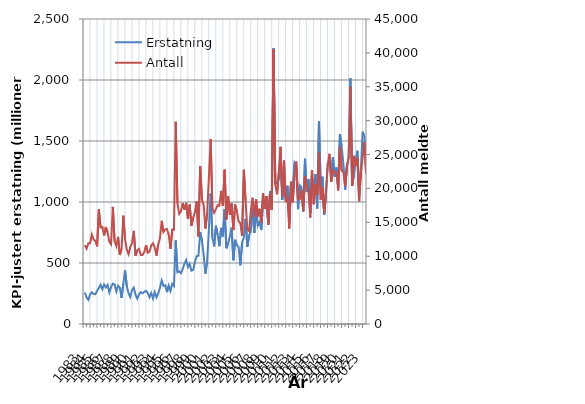
| Category | Erstatning |
|---|---|
| 1983.0 | 258.225 |
| nan | 216.303 |
| nan | 197.809 |
| nan | 242.308 |
| 1984.0 | 259.834 |
| nan | 245.784 |
| nan | 243.69 |
| nan | 272.569 |
| 1985.0 | 294.547 |
| nan | 321.948 |
| nan | 285.284 |
| nan | 323.55 |
| 1986.0 | 299.981 |
| nan | 320.992 |
| nan | 258.355 |
| nan | 302.335 |
| 1987.0 | 330.295 |
| nan | 325.94 |
| nan | 266.731 |
| nan | 313.817 |
| 1988.0 | 298.69 |
| nan | 212.92 |
| nan | 331.628 |
| nan | 439.315 |
| 1989.0 | 310.366 |
| nan | 250.85 |
| nan | 220.727 |
| nan | 278.472 |
| 1990.0 | 298.17 |
| nan | 239.878 |
| nan | 208.039 |
| nan | 242.149 |
| 1991.0 | 261.302 |
| nan | 251.241 |
| nan | 262.94 |
| nan | 271.847 |
| 1992.0 | 253.956 |
| nan | 218.822 |
| nan | 252.843 |
| nan | 208.646 |
| 1993.0 | 261.793 |
| nan | 217.87 |
| nan | 251.71 |
| nan | 297.781 |
| 1994.0 | 356.658 |
| nan | 311.8 |
| nan | 316.785 |
| nan | 261.11 |
| 1995.0 | 314.582 |
| nan | 270.634 |
| nan | 328.849 |
| nan | 312.226 |
| 1996.0 | 684.709 |
| nan | 423.984 |
| nan | 431.558 |
| nan | 416.204 |
| 1997.0 | 450.577 |
| nan | 494.432 |
| nan | 523.609 |
| nan | 467.18 |
| 1998.0 | 492.864 |
| nan | 436.631 |
| nan | 443.764 |
| nan | 510.057 |
| 1999.0 | 556.325 |
| nan | 559.028 |
| nan | 752.243 |
| nan | 681.255 |
| 2000.0 | 567.872 |
| nan | 412.399 |
| nan | 511.259 |
| nan | 779.512 |
| 2001.0 | 1069.791 |
| nan | 708.206 |
| nan | 636.063 |
| nan | 804.75 |
| 2002.0 | 732.931 |
| nan | 637.721 |
| nan | 788.114 |
| nan | 718.147 |
| 2003.0 | 939.238 |
| nan | 620.99 |
| nan | 660.655 |
| nan | 719.686 |
| 2004.0 | 789.535 |
| nan | 521.987 |
| nan | 690.088 |
| nan | 645.02 |
| 2005.0 | 631.317 |
| nan | 481.782 |
| nan | 668.844 |
| nan | 708.806 |
| 2006.0 | 861.566 |
| nan | 631.84 |
| nan | 727.01 |
| nan | 758.472 |
| 2007.0 | 949.379 |
| nan | 746.412 |
| nan | 953.667 |
| nan | 806.308 |
| 2008.0 | 833.827 |
| nan | 771.914 |
| nan | 1008.165 |
| nan | 968.238 |
| 2009.0 | 1016.058 |
| nan | 824.877 |
| nan | 1089.641 |
| nan | 1029.938 |
| 2010.0 | 2259.267 |
| nan | 1152.338 |
| nan | 1157.882 |
| nan | 1184.563 |
| 2011.0 | 1399.936 |
| nan | 1018.001 |
| nan | 1213.809 |
| nan | 1022.955 |
| 2012.0 | 1133.294 |
| nan | 828.542 |
| nan | 1142.327 |
| nan | 1075.609 |
| 2013.0 | 1320.961 |
| nan | 1293.47 |
| nan | 941.188 |
| nan | 1136.846 |
| 2014.0 | 1121.235 |
| nan | 920.756 |
| nan | 1354.48 |
| nan | 1082.988 |
| 2015.0 | 1188.179 |
| nan | 909.936 |
| nan | 1204.496 |
| nan | 1069.455 |
| 2016.0 | 1229.422 |
| nan | 946.332 |
| nan | 1659.698 |
| nan | 1126.106 |
| 2017.0 | 1207.17 |
| nan | 895.328 |
| nan | 1057.392 |
| nan | 1320.332 |
| 2018.0 | 1347.868 |
| nan | 1226.201 |
| nan | 1366.79 |
| nan | 1205.908 |
| 2019.0 | 1282.765 |
| nan | 1118.478 |
| nan | 1556.672 |
| nan | 1449.696 |
| 2020.0 | 1310.685 |
| nan | 1100.972 |
| nan | 1299.108 |
| nan | 1366.026 |
| 2021.0 | 2013.523 |
| nan | 1134.378 |
| nan | 1220.442 |
| nan | 1345.348 |
| 2022.0 | 1419.484 |
| nan | 1071.008 |
| nan | 1261.975 |
| nan | 1575.394 |
| 2023.0 | 1534.417 |
| nan | 1325.361 |